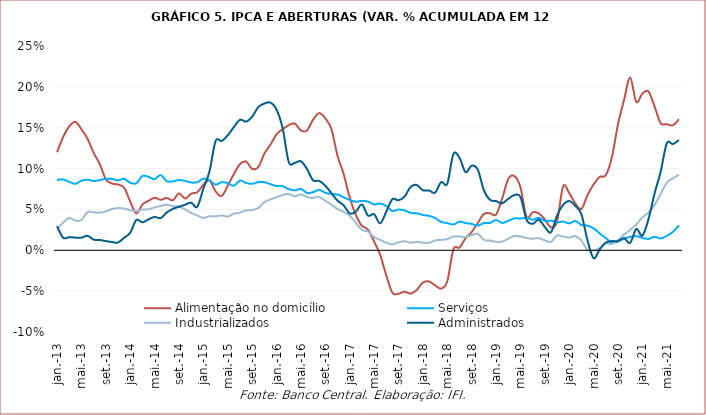
| Category | Alimentação no domicílio | Serviços | Industrializados | Administrados |
|---|---|---|---|---|
| 2013-01-01 | 0.12 | 0.086 | 0.026 | 0.029 |
| 2013-02-01 | 0.139 | 0.087 | 0.034 | 0.015 |
| 2013-03-01 | 0.152 | 0.084 | 0.039 | 0.016 |
| 2013-04-01 | 0.157 | 0.081 | 0.036 | 0.016 |
| 2013-05-01 | 0.148 | 0.085 | 0.037 | 0.015 |
| 2013-06-01 | 0.136 | 0.086 | 0.047 | 0.018 |
| 2013-07-01 | 0.119 | 0.085 | 0.046 | 0.013 |
| 2013-08-01 | 0.106 | 0.086 | 0.046 | 0.013 |
| 2013-09-01 | 0.087 | 0.087 | 0.048 | 0.011 |
| 2013-10-01 | 0.082 | 0.087 | 0.05 | 0.01 |
| 2013-11-01 | 0.081 | 0.086 | 0.052 | 0.01 |
| 2013-12-01 | 0.076 | 0.087 | 0.051 | 0.015 |
| 2014-01-01 | 0.06 | 0.083 | 0.049 | 0.021 |
| 2014-02-01 | 0.045 | 0.082 | 0.048 | 0.037 |
| 2014-03-01 | 0.056 | 0.091 | 0.05 | 0.034 |
| 2014-04-01 | 0.06 | 0.09 | 0.05 | 0.038 |
| 2014-05-01 | 0.064 | 0.087 | 0.052 | 0.041 |
| 2014-06-01 | 0.062 | 0.092 | 0.054 | 0.039 |
| 2014-07-01 | 0.064 | 0.085 | 0.056 | 0.046 |
| 2014-08-01 | 0.061 | 0.084 | 0.054 | 0.051 |
| 2014-09-01 | 0.07 | 0.086 | 0.053 | 0.053 |
| 2014-10-01 | 0.063 | 0.085 | 0.05 | 0.056 |
| 2014-11-01 | 0.069 | 0.083 | 0.046 | 0.058 |
| 2014-12-01 | 0.071 | 0.083 | 0.043 | 0.053 |
| 2015-01-01 | 0.08 | 0.088 | 0.04 | 0.075 |
| 2015-02-01 | 0.086 | 0.086 | 0.042 | 0.097 |
| 2015-03-01 | 0.072 | 0.08 | 0.042 | 0.134 |
| 2015-04-01 | 0.066 | 0.083 | 0.043 | 0.134 |
| 2015-05-01 | 0.079 | 0.082 | 0.041 | 0.141 |
| 2015-06-01 | 0.093 | 0.079 | 0.045 | 0.151 |
| 2015-07-01 | 0.105 | 0.085 | 0.046 | 0.16 |
| 2015-08-01 | 0.109 | 0.082 | 0.049 | 0.158 |
| 2015-09-01 | 0.1 | 0.081 | 0.049 | 0.164 |
| 2015-10-01 | 0.102 | 0.083 | 0.052 | 0.175 |
| 2015-11-01 | 0.118 | 0.083 | 0.059 | 0.18 |
| 2015-12-01 | 0.129 | 0.081 | 0.062 | 0.181 |
| 2016-01-01 | 0.142 | 0.079 | 0.065 | 0.172 |
| 2016-02-01 | 0.148 | 0.078 | 0.068 | 0.149 |
| 2016-03-01 | 0.153 | 0.075 | 0.069 | 0.108 |
| 2016-04-01 | 0.155 | 0.073 | 0.066 | 0.107 |
| 2016-05-01 | 0.147 | 0.075 | 0.068 | 0.109 |
| 2016-06-01 | 0.147 | 0.07 | 0.065 | 0.099 |
| 2016-07-01 | 0.16 | 0.071 | 0.064 | 0.086 |
| 2016-08-01 | 0.168 | 0.074 | 0.065 | 0.085 |
| 2016-09-01 | 0.161 | 0.07 | 0.061 | 0.079 |
| 2016-10-01 | 0.148 | 0.069 | 0.056 | 0.07 |
| 2016-11-01 | 0.116 | 0.068 | 0.051 | 0.061 |
| 2016-12-01 | 0.094 | 0.065 | 0.047 | 0.055 |
| 2017-01-01 | 0.065 | 0.062 | 0.042 | 0.045 |
| 2017-02-01 | 0.043 | 0.059 | 0.034 | 0.047 |
| 2017-03-01 | 0.03 | 0.061 | 0.025 | 0.056 |
| 2017-04-01 | 0.025 | 0.06 | 0.023 | 0.042 |
| 2017-05-01 | 0.011 | 0.056 | 0.016 | 0.044 |
| 2017-06-01 | -0.006 | 0.057 | 0.013 | 0.033 |
| 2017-07-01 | -0.031 | 0.054 | 0.009 | 0.047 |
| 2017-08-01 | -0.052 | 0.048 | 0.007 | 0.063 |
| 2017-09-01 | -0.053 | 0.05 | 0.01 | 0.061 |
| 2017-10-01 | -0.051 | 0.049 | 0.011 | 0.066 |
| 2017-11-01 | -0.053 | 0.046 | 0.009 | 0.078 |
| 2017-12-01 | -0.049 | 0.045 | 0.01 | 0.08 |
| 2018-01-01 | -0.04 | 0.043 | 0.009 | 0.074 |
| 2018-02-01 | -0.038 | 0.042 | 0.009 | 0.073 |
| 2018-03-01 | -0.043 | 0.039 | 0.012 | 0.071 |
| 2018-04-01 | -0.047 | 0.035 | 0.013 | 0.083 |
| 2018-05-01 | -0.038 | 0.033 | 0.014 | 0.081 |
| 2018-06-01 | 0.001 | 0.032 | 0.017 | 0.118 |
| 2018-07-01 | 0.003 | 0.035 | 0.017 | 0.113 |
| 2018-08-01 | 0.015 | 0.033 | 0.016 | 0.096 |
| 2018-09-01 | 0.022 | 0.032 | 0.018 | 0.104 |
| 2018-10-01 | 0.033 | 0.03 | 0.02 | 0.099 |
| 2018-11-01 | 0.044 | 0.033 | 0.013 | 0.074 |
| 2018-12-01 | 0.045 | 0.033 | 0.012 | 0.062 |
| 2019-01-01 | 0.044 | 0.037 | 0.01 | 0.06 |
| 2019-02-01 | 0.063 | 0.033 | 0.011 | 0.057 |
| 2019-03-01 | 0.087 | 0.036 | 0.014 | 0.063 |
| 2019-04-01 | 0.091 | 0.039 | 0.017 | 0.068 |
| 2019-05-01 | 0.077 | 0.039 | 0.017 | 0.065 |
| 2019-06-01 | 0.041 | 0.04 | 0.015 | 0.037 |
| 2019-07-01 | 0.046 | 0.037 | 0.014 | 0.032 |
| 2019-08-01 | 0.045 | 0.04 | 0.015 | 0.037 |
| 2019-09-01 | 0.038 | 0.036 | 0.012 | 0.029 |
| 2019-10-01 | 0.028 | 0.036 | 0.01 | 0.022 |
| 2019-11-01 | 0.035 | 0.034 | 0.018 | 0.042 |
| 2019-12-01 | 0.078 | 0.035 | 0.017 | 0.055 |
| 2020-01-01 | 0.07 | 0.033 | 0.016 | 0.06 |
| 2020-02-01 | 0.058 | 0.036 | 0.017 | 0.054 |
| 2020-03-01 | 0.051 | 0.031 | 0.012 | 0.044 |
| 2020-04-01 | 0.068 | 0.03 | 0 | 0.012 |
| 2020-05-01 | 0.081 | 0.027 | 0 | -0.01 |
| 2020-06-01 | 0.09 | 0.021 | 0.003 | 0.001 |
| 2020-07-01 | 0.092 | 0.015 | 0.008 | 0.009 |
| 2020-08-01 | 0.114 | 0.009 | 0.008 | 0.011 |
| 2020-09-01 | 0.154 | 0.011 | 0.013 | 0.011 |
| 2020-10-01 | 0.184 | 0.014 | 0.019 | 0.015 |
| 2020-11-01 | 0.211 | 0.016 | 0.025 | 0.009 |
| 2020-12-01 | 0.182 | 0.017 | 0.032 | 0.026 |
| 2021-01-01 | 0.192 | 0.015 | 0.04 | 0.018 |
| 2021-02-01 | 0.194 | 0.014 | 0.046 | 0.038 |
| 2021-03-01 | 0.176 | 0.017 | 0.055 | 0.07 |
| 2021-04-01 | 0.156 | 0.015 | 0.069 | 0.096 |
| 2021-05-01 | 0.154 | 0.018 | 0.083 | 0.131 |
| 2021-06-01 | 0.153 | 0.023 | 0.088 | 0.13 |
| 2021-07-01 | 0.16 | 0.03 | 0.092 | 0.135 |